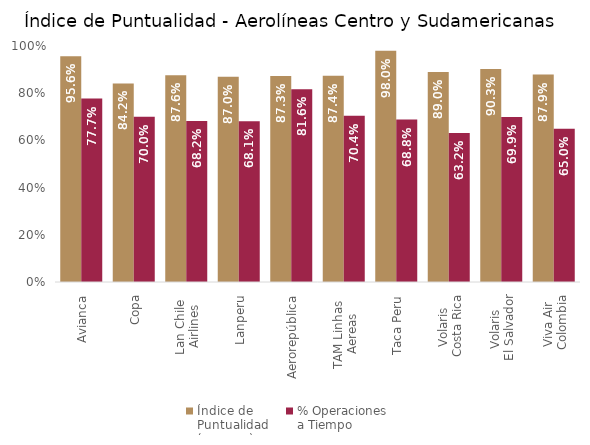
| Category | Índice de 
Puntualidad
(ene-sep) | % Operaciones 
a Tiempo |
|---|---|---|
| Avianca | 0.956 | 0.777 |
| Copa | 0.842 | 0.7 |
| Lan Chile 
Airlines | 0.876 | 0.682 |
| Lanperu | 0.87 | 0.681 |
| Aerorepública | 0.873 | 0.816 |
| TAM Linhas 
Aereas | 0.874 | 0.704 |
| Taca Peru | 0.98 | 0.688 |
| Volaris 
Costa Rica | 0.89 | 0.632 |
| Volaris 
El Salvador | 0.903 | 0.699 |
| Viva Air 
Colombia | 0.879 | 0.65 |